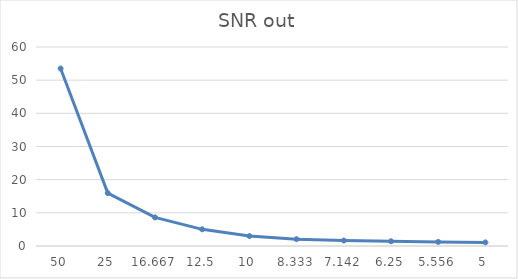
| Category | SNR out |
|---|---|
| 50.0 | 53.517 |
| 25.0 | 15.956 |
| 16.667 | 8.615 |
| 12.5 | 5.024 |
| 10.0 | 2.989 |
| 8.333 | 2.059 |
| 7.142 | 1.646 |
| 6.25 | 1.422 |
| 5.556 | 1.236 |
| 5.0 | 1.079 |